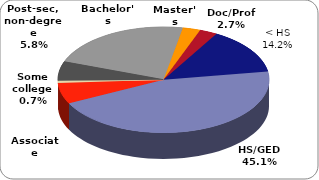
| Category | Series 0 |
|---|---|
| < High school | 0.142 |
| High school/
GED | 0.451 |
| Associate | 0.064 |
| Some college, no degree | 0.007 |
| Post-secondary,
non-degree | 0.058 |
| Bachelor's | 0.224 |
| Master's | 0.027 |
| Doctoral / Professional | 0.027 |